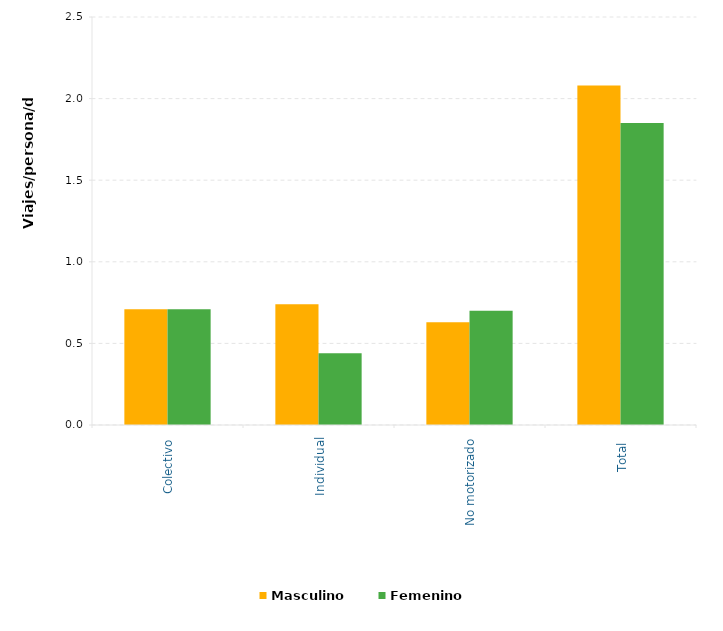
| Category | Masculino | Femenino |
|---|---|---|
| Colectivo | 0.71 | 0.71 |
| Individual | 0.74 | 0.44 |
| No motorizado | 0.63 | 0.7 |
| Total  | 2.08 | 1.85 |